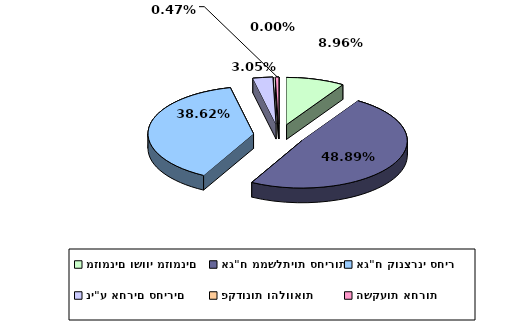
| Category | Series 0 |
|---|---|
| מזומנים ושווי מזומנים | 0.09 |
| אג"ח ממשלתיות סחירות | 0.489 |
| אג"ח קונצרני סחיר | 0.386 |
| ני"ע אחרים סחירים | 0.031 |
| פקדונות והלוואות | 0 |
| השקעות אחרות | 0.005 |